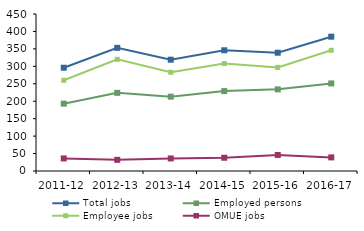
| Category | Total jobs | Employed persons | Employee jobs | OMUE jobs |
|---|---|---|---|---|
| 2011-12 | 296 | 193 | 260 | 36 |
| 2012-13 | 353 | 224 | 320 | 32 |
| 2013-14 | 319 | 213 | 283 | 36 |
| 2014-15 | 346 | 229 | 308 | 38 |
| 2015-16 | 339 | 234 | 297 | 46 |
| 2016-17 | 385 | 251 | 346 | 39 |